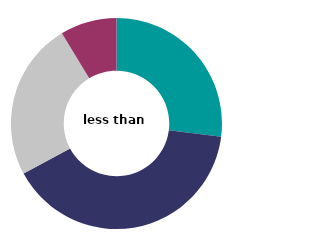
| Category | less than 70m² |
|---|---|
| 1 or 2 | 27.011 |
| 3 | 40.135 |
| 4 | 24.198 |
| 5 or more | 8.657 |